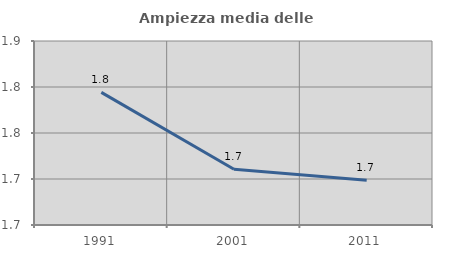
| Category | Ampiezza media delle famiglie |
|---|---|
| 1991.0 | 1.794 |
| 2001.0 | 1.711 |
| 2011.0 | 1.699 |